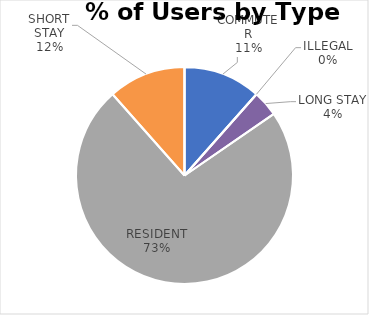
| Category | CHISHOLM ROAD |
|---|---|
| COMMUTER | 6 |
| ILLEGAL | 0 |
| LONG STAY | 2 |
| RESIDENT | 38 |
| SHORT STAY | 6 |
| DISABLED | 0 |
| OTHER | 0 |